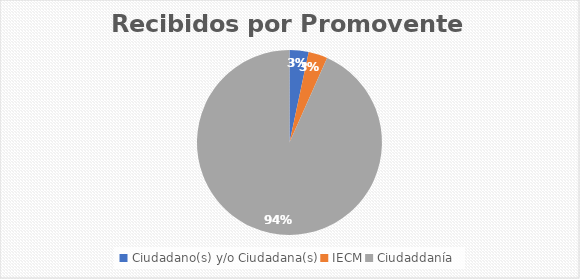
| Category | Series 0 |
|---|---|
| Ciudadano(s) y/o Ciudadana(s) | 1 |
| IECM | 1 |
| Ciudaddanía | 28 |